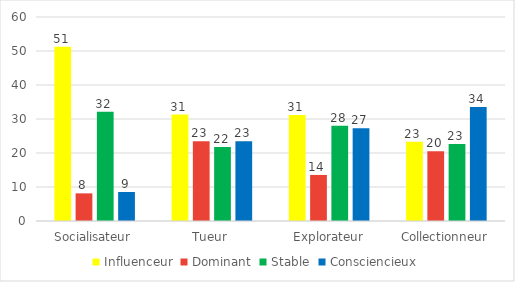
| Category | Influenceur | Dominant | Stable | Consciencieux |
|---|---|---|---|---|
| Socialisateur | 51.22 | 8.13 | 32.114 | 8.537 |
| Tueur | 31.304 | 23.478 | 21.739 | 23.478 |
| Explorateur | 31.151 | 13.544 | 27.991 | 27.314 |
| Collectionneur | 23.292 | 20.497 | 22.671 | 33.54 |